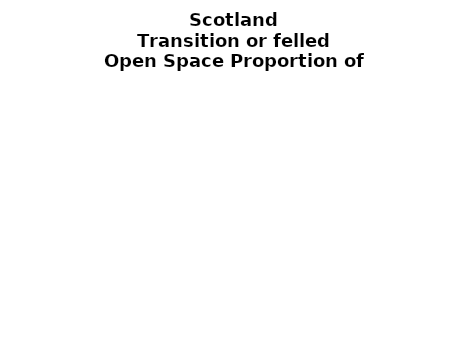
| Category | Transition or felled |
|---|---|
|  ≥ 10ha, < 10%  | 0.1 |
|   ≥ 10ha, 10-25% | 0.037 |
|   ≥ 10ha, > 25 and <50%  | 0.109 |
|   ≥ 10ha, ≥ 50%  | 0.598 |
|  < 10ha, < 10% | 0 |
|  < 10ha, 10-25% | 0 |
|  < 10ha, > 25 and < 50% | 0.012 |
|  < 10ha, ≥ 50% | 0.145 |